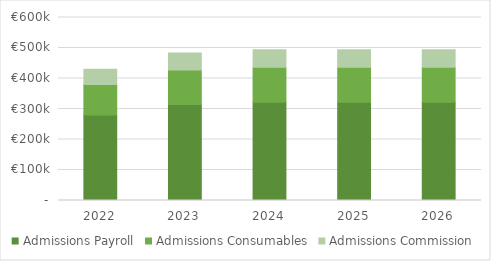
| Category | Admissions Payroll | Admissions Consumables | Admissions Commission |
|---|---|---|---|
| 2022.0 | 280000 | 100000 | 50000 |
| 2023.0 | 315000 | 112500 | 56250 |
| 2024.0 | 322000 | 115000 | 57500 |
| 2025.0 | 322000 | 115000 | 57500 |
| 2026.0 | 322000 | 115000 | 57500 |